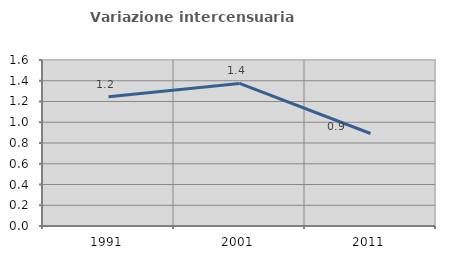
| Category | Variazione intercensuaria annua |
|---|---|
| 1991.0 | 1.245 |
| 2001.0 | 1.374 |
| 2011.0 | 0.891 |